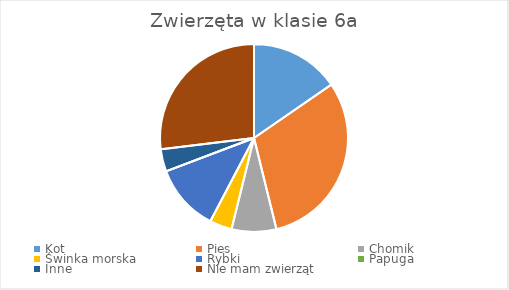
| Category | Series 0 |
|---|---|
| Kot | 4 |
| Pies | 8 |
| Chomik | 2 |
| Świnka morska | 1 |
| Rybki | 3 |
| Papuga | 0 |
| Inne | 1 |
| Nie mam zwierząt | 7 |